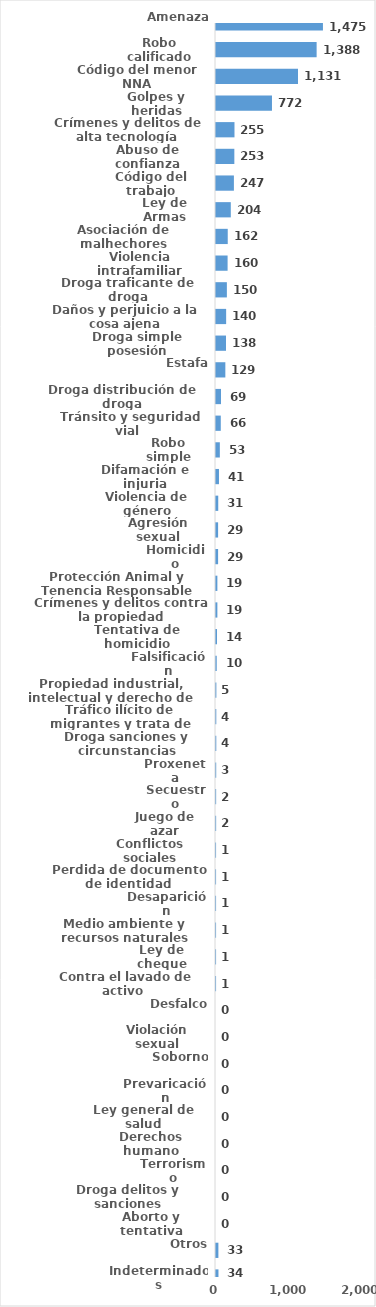
| Category | Series 0 |
|---|---|
| Amenaza | 1475 |
| Robo calificado | 1388 |
| Código del menor NNA | 1131 |
| Golpes y heridas | 772 |
| Crímenes y delitos de alta tecnología | 255 |
| Abuso de confianza | 253 |
| Código del trabajo | 247 |
| Ley de Armas | 204 |
| Asociación de malhechores | 162 |
| Violencia intrafamiliar | 160 |
| Droga traficante de droga | 150 |
| Daños y perjuicio a la cosa ajena | 140 |
| Droga simple posesión | 138 |
| Estafa | 129 |
| Droga distribución de droga | 69 |
| Tránsito y seguridad vial  | 66 |
| Robo simple | 53 |
| Difamación e injuria | 41 |
| Violencia de género | 31 |
| Agresión sexual | 29 |
| Homicidio | 29 |
| Protección Animal y Tenencia Responsable | 19 |
| Crímenes y delitos contra la propiedad | 19 |
| Tentativa de homicidio | 14 |
| Falsificación | 10 |
| Propiedad industrial, intelectual y derecho de autor | 5 |
| Tráfico ilícito de migrantes y trata de personas | 4 |
| Droga sanciones y circunstancias agravantes | 4 |
| Proxeneta | 3 |
| Secuestro | 2 |
| Juego de azar | 2 |
| Conflictos sociales | 1 |
| Perdida de documento de identidad | 1 |
| Desaparición | 1 |
| Medio ambiente y recursos naturales | 1 |
| Ley de cheque | 1 |
| Contra el lavado de activo  | 1 |
| Desfalco | 0 |
| Violación sexual | 0 |
| Soborno | 0 |
| Prevaricación | 0 |
| Ley general de salud | 0 |
| Derechos humano | 0 |
| Terrorismo | 0 |
| Droga delitos y sanciones | 0 |
| Aborto y tentativa | 0 |
| Otros | 33 |
| Indeterminados | 34 |